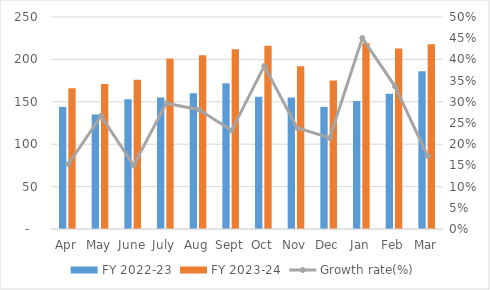
| Category | FY 2022-23 | FY 2023-24 |
|---|---|---|
| Apr | 144 | 166 |
| May | 135 | 171 |
| June | 153 | 176 |
| July | 155 | 201 |
| Aug | 160 | 205 |
| Sept | 172 | 212 |
| Oct | 156 | 216 |
| Nov | 155 | 192 |
| Dec | 144.048 | 175 |
| Jan | 151 | 219 |
| Feb | 159.377 | 213 |
| Mar | 186 | 218 |